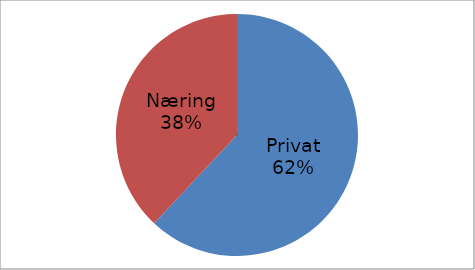
| Category | Series 0 |
|---|---|
| Privat | 34266257 |
| Næring | 20991971 |